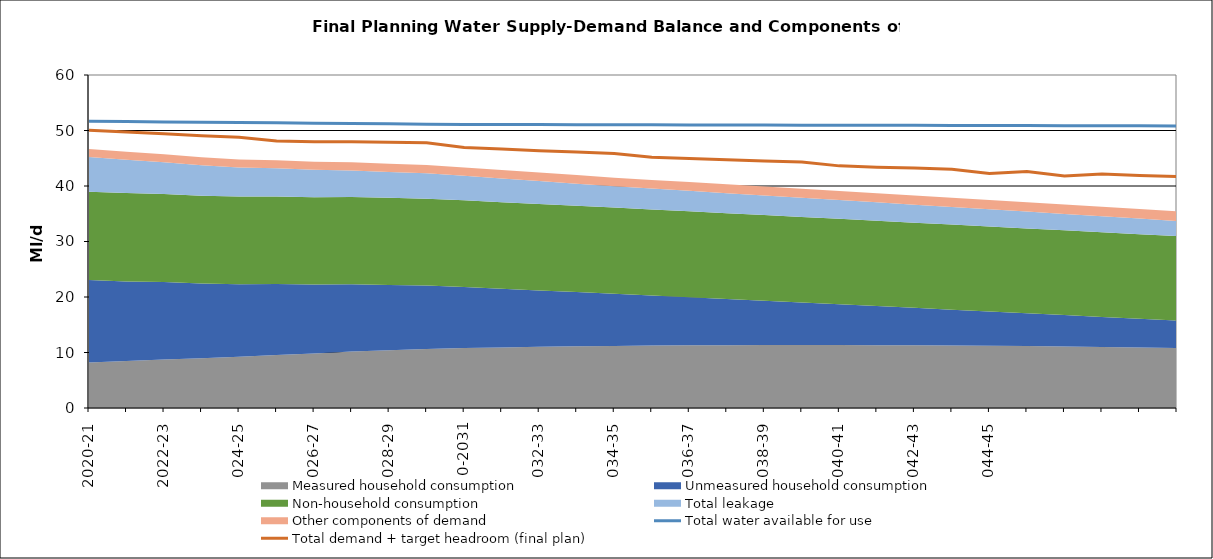
| Category | Total water available for use | Total demand + target headroom (final plan) |
|---|---|---|
| 2020-21 | 51.668 | 50.03 |
| 2021-22 | 51.609 | 49.728 |
| 2022-23 | 51.551 | 49.43 |
| 2023-24 | 51.493 | 49.052 |
| 2024-25 | 51.434 | 48.769 |
| 2025-26 | 51.376 | 48.102 |
| 2026-27 | 51.318 | 47.969 |
| 2027-28 | 51.26 | 47.988 |
| 2028-29 | 51.201 | 47.873 |
| 2029-30 | 51.143 | 47.782 |
| 2030-31 | 51.099 | 46.948 |
| 2031-32 | 51.085 | 46.649 |
| 2032-33 | 51.07 | 46.365 |
| 2033-34 | 51.056 | 46.107 |
| 2034-35 | 51.041 | 45.84 |
| 2035-36 | 51.027 | 45.165 |
| 2036-37 | 51.012 | 44.941 |
| 2037-38 | 50.997 | 44.728 |
| 2038-39 | 50.983 | 44.521 |
| 2039-40 | 50.968 | 44.32 |
| 2040-41 | 50.954 | 43.627 |
| 2041-42 | 50.939 | 43.401 |
| 2042-43 | 50.925 | 43.248 |
| 2043-44 | 50.91 | 43.001 |
| 2044-45 | 50.896 | 42.256 |
| 2045-46 | 50.881 | 42.602 |
| 2046-47 | 50.866 | 41.802 |
| 2047-48 | 50.852 | 42.176 |
| 2048-49 | 50.837 | 41.91 |
| 2049-50 | 50.823 | 41.697 |